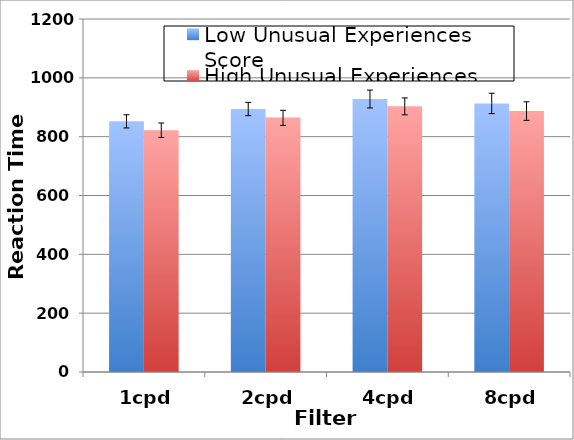
| Category | Low Unusual Experiences Score | High Unusual Experiences Score |
|---|---|---|
| 1cpd | 852 | 822 |
| 2cpd | 894 | 864 |
| 4cpd | 928 | 903 |
| 8cpd | 913 | 887 |